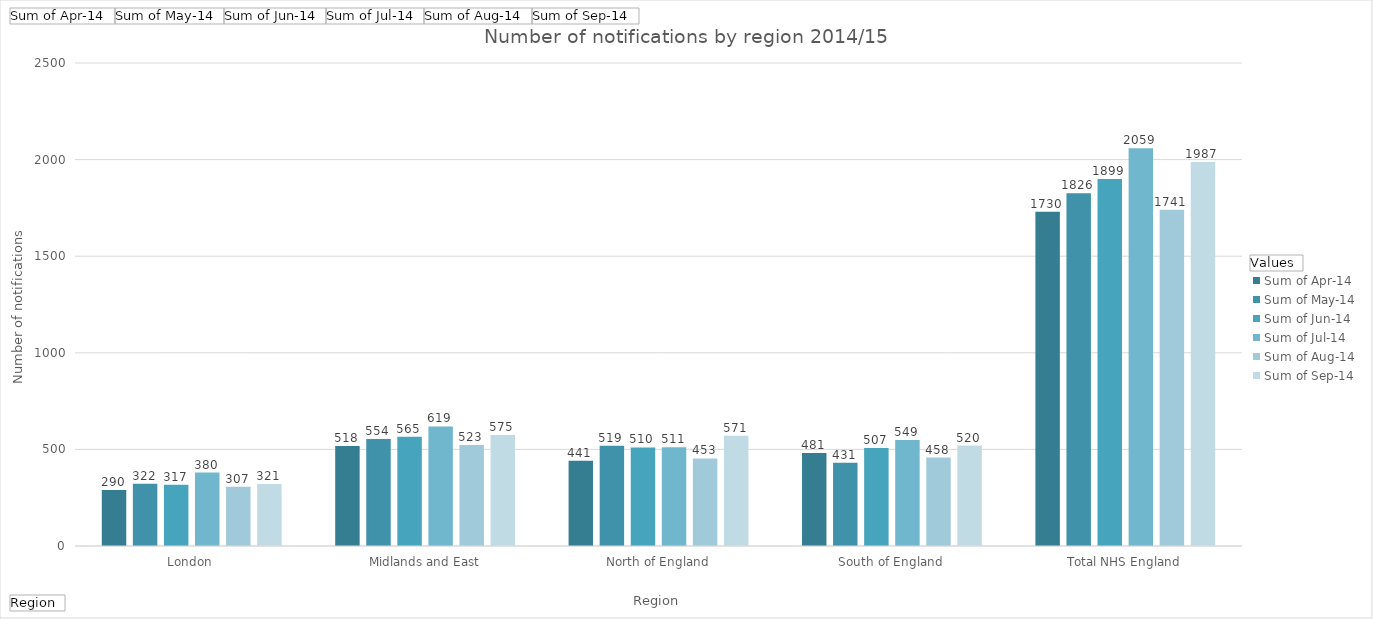
| Category | Sum of Apr-14 | Sum of May-14 | Sum of Jun-14 | Sum of Jul-14 | Sum of Aug-14 | Sum of Sep-14 |
|---|---|---|---|---|---|---|
| London | 290 | 322 | 317 | 380 | 307 | 321 |
| Midlands and East | 518 | 554 | 565 | 619 | 523 | 575 |
| North of England | 441 | 519 | 510 | 511 | 453 | 571 |
| South of England | 481 | 431 | 507 | 549 | 458 | 520 |
| Total NHS England | 1730 | 1826 | 1899 | 2059 | 1741 | 1987 |